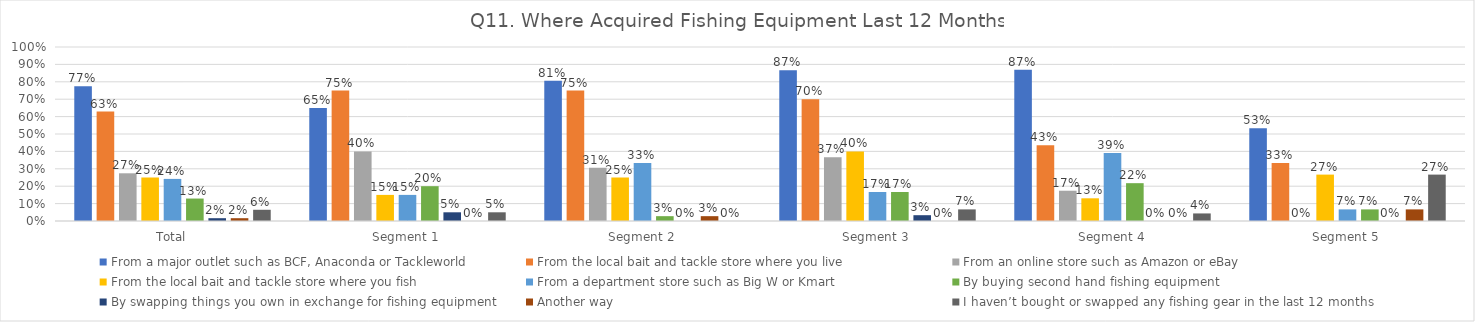
| Category | From a major outlet such as BCF, Anaconda or Tackleworld | From the local bait and tackle store where you live | From an online store such as Amazon or eBay | From the local bait and tackle store where you fish | From a department store such as Big W or Kmart | By buying second hand fishing equipment | By swapping things you own in exchange for fishing equipment | Another way | I haven’t bought or swapped any fishing gear in the last 12 months |
|---|---|---|---|---|---|---|---|---|---|
| Total | 0.774 | 0.629 | 0.274 | 0.25 | 0.242 | 0.129 | 0.016 | 0.016 | 0.065 |
| Segment 1 | 0.65 | 0.75 | 0.4 | 0.15 | 0.15 | 0.2 | 0.05 | 0 | 0.05 |
| Segment 2 | 0.806 | 0.75 | 0.306 | 0.25 | 0.333 | 0.028 | 0 | 0.028 | 0 |
| Segment 3 | 0.867 | 0.7 | 0.367 | 0.4 | 0.167 | 0.167 | 0.033 | 0 | 0.067 |
| Segment 4 | 0.87 | 0.435 | 0.174 | 0.13 | 0.391 | 0.217 | 0 | 0 | 0.043 |
| Segment 5 | 0.533 | 0.333 | 0 | 0.267 | 0.067 | 0.067 | 0 | 0.067 | 0.267 |